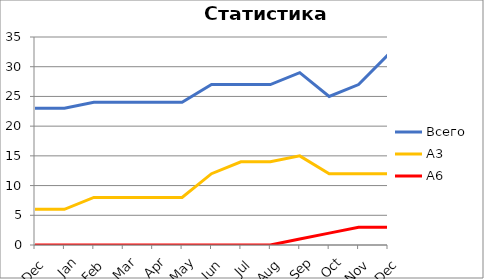
| Category | Всего | А3 | A6 |
|---|---|---|---|
| 0 | 23 | 6 | 0 |
| 1 | 23 | 6 | 0 |
| 2 | 24 | 8 | 0 |
| 3 | 24 | 8 | 0 |
| 4 | 24 | 8 | 0 |
| 5 | 24 | 8 | 0 |
| 6 | 27 | 12 | 0 |
| 7 | 27 | 14 | 0 |
| 8 | 27 | 14 | 0 |
| 9 | 29 | 15 | 1 |
| 10 | 25 | 12 | 2 |
| 11 | 27 | 12 | 3 |
| 12 | 32 | 12 | 3 |